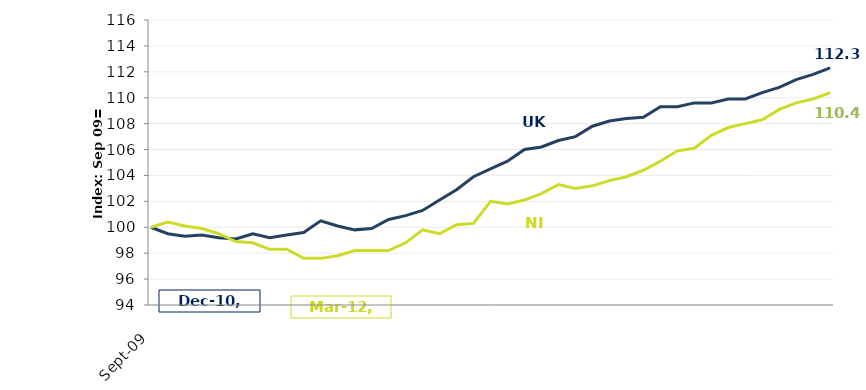
| Category | UK |
|---|---|
| 2009-09-01 | 100 |
| 2009-12-01 | 99.5 |
| 2010-03-01 | 99.3 |
| 2010-06-01 | 99.4 |
| 2010-09-01 | 99.2 |
| 2010-12-01 | 99.1 |
| 2011-03-01 | 99.5 |
| 2011-06-01 | 99.2 |
| 2011-09-01 | 99.4 |
| 2011-12-01 | 99.6 |
| 2012-03-01 | 100.5 |
| 2012-06-01 | 100.1 |
| 2012-09-01 | 99.8 |
| 2012-12-01 | 99.9 |
| 2013-03-01 | 100.6 |
| 2013-06-01 | 100.9 |
| 2013-09-01 | 101.3 |
| 2013-12-01 | 102.1 |
| 2014-03-01 | 102.9 |
| 2014-06-01 | 103.9 |
| 2014-09-01 | 104.5 |
| 2014-12-01 | 105.1 |
| 2015-03-01 | 106 |
| 2015-06-01 | 106.2 |
| 2015-09-01 | 106.7 |
| 2015-12-01 | 107 |
| 2016-03-01 | 107.8 |
| 2016-06-01 | 108.2 |
| 2016-09-01 | 108.4 |
| 2016-12-01 | 108.5 |
| 2017-03-01 | 109.3 |
| 2017-06-01 | 109.3 |
| 2017-09-01 | 109.6 |
| 2017-12-01 | 109.6 |
| 2018-03-01 | 109.9 |
| 2018-06-01 | 109.9 |
| 2018-09-01 | 110.4 |
| 2018-12-01 | 110.8 |
| 2019-03-01 | 111.4 |
| 2019-06-01 | 111.8 |
| 2019-09-01 | 112.3 |